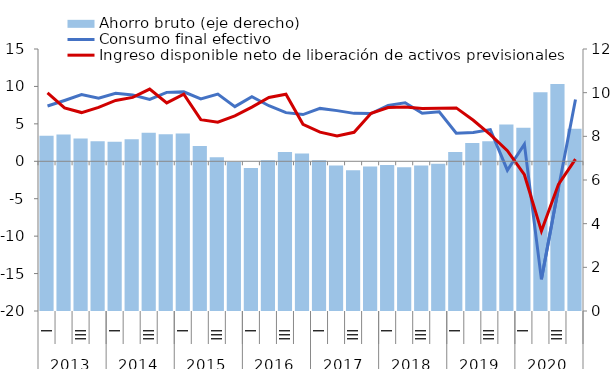
| Category | Ahorro bruto (eje derecho) |
|---|---|
| 0 | 8.026 |
| 1 | 8.088 |
| 2 | 7.899 |
| 3 | 7.77 |
| 4 | 7.756 |
| 5 | 7.868 |
| 6 | 8.166 |
| 7 | 8.096 |
| 8 | 8.13 |
| 9 | 7.561 |
| 10 | 7.047 |
| 11 | 6.827 |
| 12 | 6.55 |
| 13 | 6.9 |
| 14 | 7.282 |
| 15 | 7.209 |
| 16 | 6.907 |
| 17 | 6.662 |
| 18 | 6.448 |
| 19 | 6.614 |
| 20 | 6.688 |
| 21 | 6.589 |
| 22 | 6.664 |
| 23 | 6.741 |
| 24 | 7.287 |
| 25 | 7.691 |
| 26 | 7.776 |
| 27 | 8.537 |
| 28 | 8.391 |
| 29 | 10.014 |
| 30 | 10.393 |
| 31 | 8.346 |